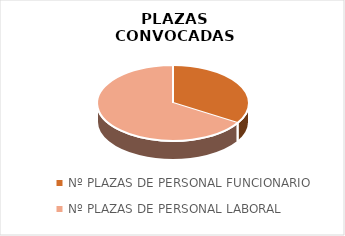
| Category | Series 0 |
|---|---|
| Nº PLAZAS DE PERSONAL FUNCIONARIO | 1983 |
| Nº PLAZAS DE PERSONAL LABORAL | 3869 |